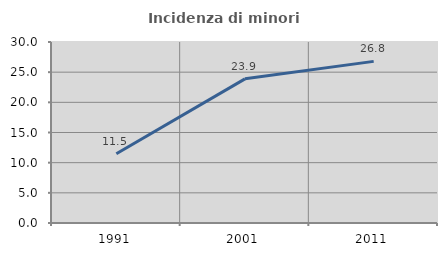
| Category | Incidenza di minori stranieri |
|---|---|
| 1991.0 | 11.474 |
| 2001.0 | 23.893 |
| 2011.0 | 26.789 |